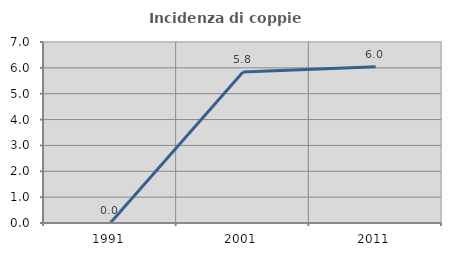
| Category | Incidenza di coppie miste |
|---|---|
| 1991.0 | 0 |
| 2001.0 | 5.839 |
| 2011.0 | 6.04 |